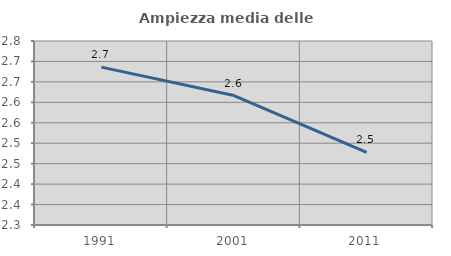
| Category | Ampiezza media delle famiglie |
|---|---|
| 1991.0 | 2.686 |
| 2001.0 | 2.616 |
| 2011.0 | 2.478 |